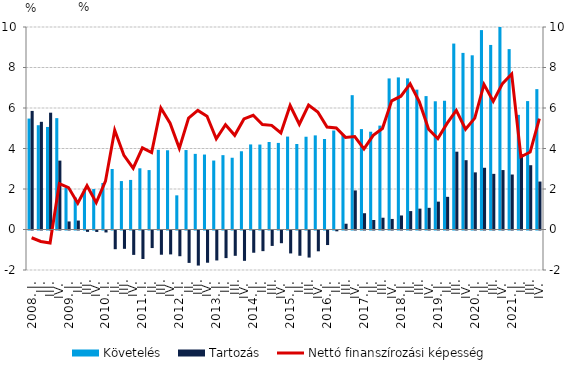
| Category | Követelés | Tartozás |
|---|---|---|
| 2008. I. | 5.478 | 5.857 |
| II. | 5.15 | 5.318 |
| III. | 5.065 | 5.769 |
| IV. | 5.5 | 3.402 |
| 2009. I. | 2.051 | 0.398 |
|          II. | 1.582 | 0.442 |
|          III. | 1.995 | -0.067 |
|          IV. | 1.997 | -0.071 |
| 2010. I. | 2.298 | -0.096 |
|          II. | 2.989 | -0.924 |
|          III. | 2.392 | -0.905 |
|          IV. | 2.448 | -1.204 |
| 2011. I. | 3.023 | -1.407 |
|          II. | 2.934 | -0.867 |
|          III. | 3.936 | -1.197 |
|          IV. | 3.913 | -1.181 |
| 2012. I. | 1.687 | -1.27 |
|          II. | 3.924 | -1.6 |
|          III. | 3.735 | -1.732 |
|          IV. | 3.702 | -1.592 |
| 2013. I. | 3.405 | -1.479 |
| II. | 3.672 | -1.363 |
|          III. | 3.544 | -1.25 |
| IV. | 3.864 | -1.498 |
| 2014. I. | 4.201 | -1.098 |
| II. | 4.195 | -1.019 |
|          III. | 4.322 | -0.761 |
| IV. | 4.276 | -0.627 |
| 2015. I. | 4.589 | -1.132 |
| II. | 4.221 | -1.247 |
|          III. | 4.581 | -1.336 |
| IV. | 4.648 | -1.028 |
| 2016. I. | 4.468 | -0.718 |
| II. | 4.888 | -0.041 |
|          III. | 4.685 | 0.285 |
| IV. | 6.634 | 1.93 |
| 2017. I. | 4.959 | 0.804 |
| II. | 4.829 | 0.469 |
|          III. | 5.131 | 0.582 |
| IV. | 7.461 | 0.521 |
| 2018. I. | 7.51 | 0.693 |
| II. | 7.463 | 0.909 |
|          III. | 6.907 | 1.03 |
| IV. | 6.588 | 1.07 |
| 2019. I. | 6.332 | 1.376 |
| II. | 6.355 | 1.614 |
|          III. | 9.182 | 3.843 |
| IV. | 8.721 | 3.422 |
| 2020. I. | 8.602 | 2.821 |
| II. | 9.847 | 3.048 |
|          III. | 9.114 | 2.748 |
| IV. | 10.24 | 2.935 |
| 2021. I. | 8.908 | 2.715 |
| II. | 5.661 | 3.714 |
|          III. | 6.341 | 3.175 |
| IV. | 6.932 | 2.368 |